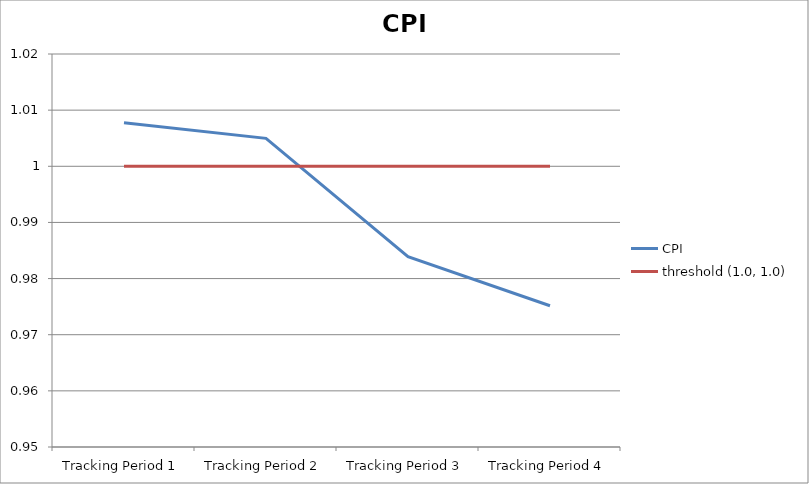
| Category | CPI | threshold (1.0, 1.0) |
|---|---|---|
| Tracking Period 1 | 1.008 | 1 |
| Tracking Period 2 | 1.005 | 1 |
| Tracking Period 3 | 0.984 | 1 |
| Tracking Period 4 | 0.975 | 1 |